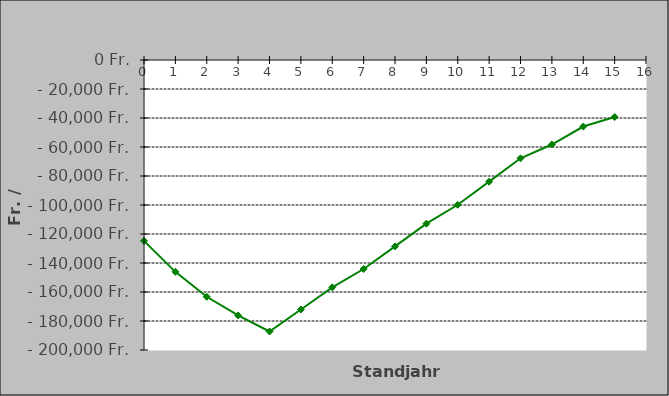
| Category | Series 0 |
|---|---|
| 0.0 | -124765.916 |
| 1.0 | -146096.274 |
| 2.0 | -163288.514 |
| 3.0 | -176166.725 |
| 4.0 | -187243.737 |
| 5.0 | -172073.953 |
| 6.0 | -156767.641 |
| 7.0 | -144133.776 |
| 8.0 | -128576.003 |
| 9.0 | -112878.209 |
| 10.0 | -99849.339 |
| 11.0 | -83893.006 |
| 12.0 | -67793.066 |
| 13.0 | -58281.143 |
| 14.0 | -45873.41 |
| 15.0 | -39354.008 |